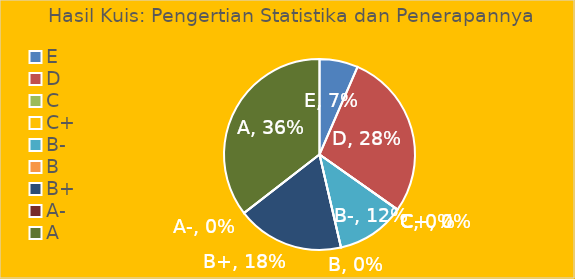
| Category | Banyaknya Mahasiswa |
|---|---|
| E | 0.065 |
| D | 0.283 |
| C | 0 |
| C+ | 0 |
| B- | 0.116 |
| B | 0 |
| B+ | 0.181 |
| A- | 0 |
| A | 0.355 |